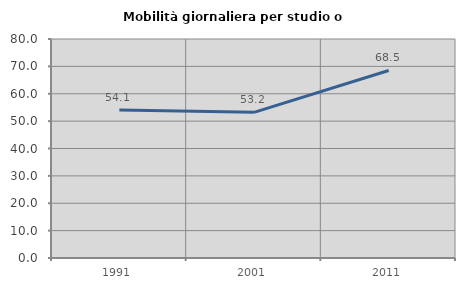
| Category | Mobilità giornaliera per studio o lavoro |
|---|---|
| 1991.0 | 54.07 |
| 2001.0 | 53.205 |
| 2011.0 | 68.499 |